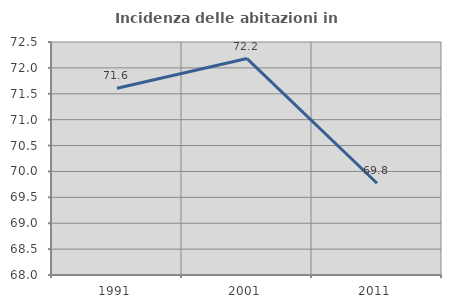
| Category | Incidenza delle abitazioni in proprietà  |
|---|---|
| 1991.0 | 71.608 |
| 2001.0 | 72.18 |
| 2011.0 | 69.772 |